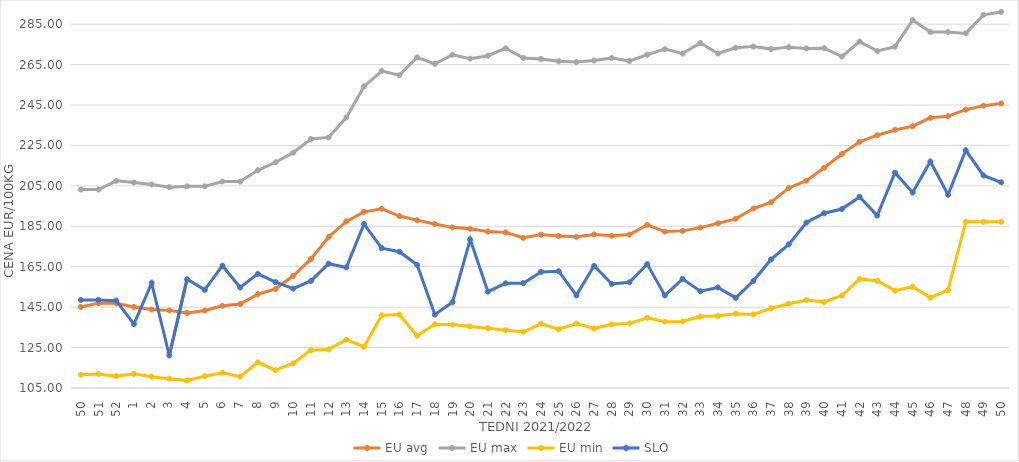
| Category | EU avg | EU max | EU min | SLO |
|---|---|---|---|---|
| 50.0 | 145.101 | 203.17 | 111.54 | 148.55 |
| 51.0 | 146.984 | 203.17 | 111.93 | 148.54 |
| 52.0 | 146.958 | 207.5 | 110.85 | 148.22 |
| 1.0 | 145.11 | 206.66 | 112.04 | 136.59 |
| 2.0 | 143.822 | 205.67 | 110.59 | 156.88 |
| 3.0 | 143.402 | 204.34 | 109.62 | 121.07 |
| 4.0 | 142.134 | 204.76 | 108.71 | 158.82 |
| 5.0 | 143.314 | 204.76 | 110.86 | 153.55 |
| 6.0 | 145.677 | 207.14 | 112.52 | 165.51 |
| 7.0 | 146.556 | 207.14 | 110.619 | 154.74 |
| 8.0 | 151.439 | 212.7 | 117.709 | 161.48 |
| 9.0 | 153.947 | 216.67 | 113.871 | 157.38 |
| 10.0 | 160.496 | 221.43 | 117.233 | 154.16 |
| 11.0 | 168.845 | 228.17 | 123.737 | 157.96 |
| 12.0 | 179.714 | 228.97 | 124.105 | 166.49 |
| 13.0 | 187.409 | 238.81 | 128.918 | 164.66 |
| 14.0 | 192.137 | 254.21 | 125.399 | 186.11 |
| 15.0 | 193.697 | 261.79 | 140.954 | 174.18 |
| 16.0 | 190.066 | 259.76 | 141.337 | 172.42 |
| 17.0 | 188.031 | 268.52 | 130.897 | 165.96 |
| 18.0 | 186.119 | 265.34 | 136.529 | 141.36 |
| 19.0 | 184.47 | 269.87 | 136.387 | 147.43 |
| 20.0 | 183.734 | 267.92 | 135.392 | 178.51 |
| 21.0 | 182.45 | 269.38 | 134.589 | 152.67 |
| 22.0 | 181.991 | 273.06 | 133.621 | 156.8 |
| 23.0 | 179.308 | 268.27 | 132.787 | 156.84 |
| 24.0 | 180.886 | 267.77 | 136.75 | 162.44 |
| 25.0 | 180.2 | 266.63 | 134.058 | 162.78 |
| 26.0 | 179.77 | 266.27 | 136.895 | 150.82 |
| 27.0 | 180.992 | 267.02 | 134.44 | 165.45 |
| 28.0 | 180.305 | 268.25 | 136.486 | 156.46 |
| 29.0 | 180.913 | 266.77 | 136.97 | 157.31 |
| 30.0 | 185.728 | 269.87 | 139.777 | 166.29 |
| 31.0 | 182.385 | 272.64 | 137.828 | 150.81 |
| 32.0 | 182.73 | 270.47 | 137.934 | 158.99 |
| 33.0 | 184.343 | 275.68 | 140.33 | 152.91 |
| 34.0 | 186.448 | 270.49 | 140.7 | 154.73 |
| 35.0 | 188.684 | 273.33 | 141.78 | 149.6 |
| 36.0 | 193.792 | 273.91 | 141.41 | 157.93 |
| 37.0 | 196.877 | 272.67 | 144.47 | 168.61 |
| 38.0 | 203.962 | 273.63 | 146.68 | 176.07 |
| 39.0 | 207.574 | 272.98 | 148.499 | 186.86 |
| 40.0 | 213.98 | 273.1 | 147.54 | 191.45 |
| 41.0 | 220.759 | 268.98 | 150.75 | 193.52 |
| 42.0 | 226.81 | 276.39 | 158.87 | 199.51 |
| 43.0 | 230.056 | 271.72 | 158.04 | 190.28 |
| 44.0 | 232.707 | 273.856 | 153.16 | 211.53 |
| 45.0 | 234.505 | 287.021 | 155.13 | 201.69 |
| 46.0 | 238.688 | 281.133 | 149.75 | 217.08 |
| 47.0 | 239.488 | 281.102 | 153.36 | 200.62 |
| 48.0 | 242.694 | 280.434 | 187.26 | 222.61 |
| 49.0 | 244.684 | 289.585 | 187.26 | 210.16 |
| 50.0 | 245.783 | 291.057 | 187.26 | 206.76 |